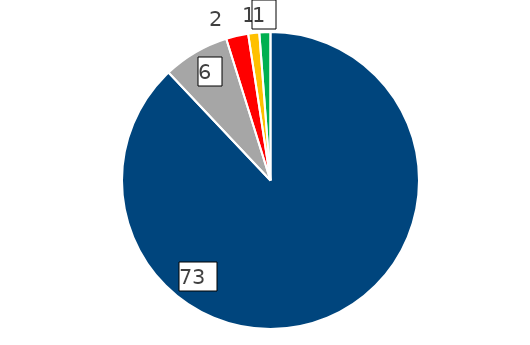
| Category | 2020 |
|---|---|
| E-mail a Transparencia CORREOS | 73 |
| Portal Transparencia AGE | 6 |
| Registro general CORREOS | 2 |
| Correo postal a Transparencia CORREOS | 1 |
| Otros | 1 |